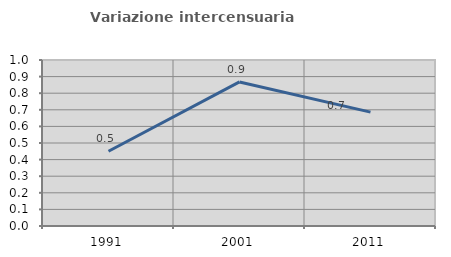
| Category | Variazione intercensuaria annua |
|---|---|
| 1991.0 | 0.45 |
| 2001.0 | 0.868 |
| 2011.0 | 0.686 |